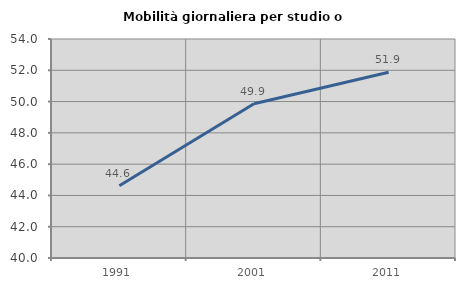
| Category | Mobilità giornaliera per studio o lavoro |
|---|---|
| 1991.0 | 44.624 |
| 2001.0 | 49.866 |
| 2011.0 | 51.876 |